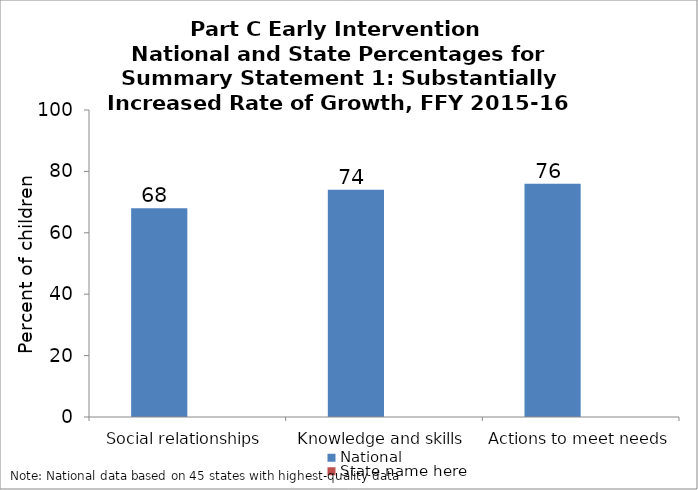
| Category | National | State name here |
|---|---|---|
| Social relationships | 68 |  |
| Knowledge and skills | 74 |  |
| Actions to meet needs | 76 |  |